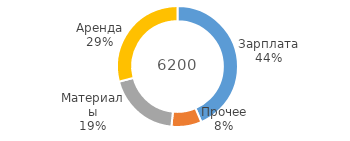
| Category | дек |
|---|---|
| Зарплата | 2700 |
| Прочее | 500 |
| Материалы | 1200 |
| Аренда | 1800 |